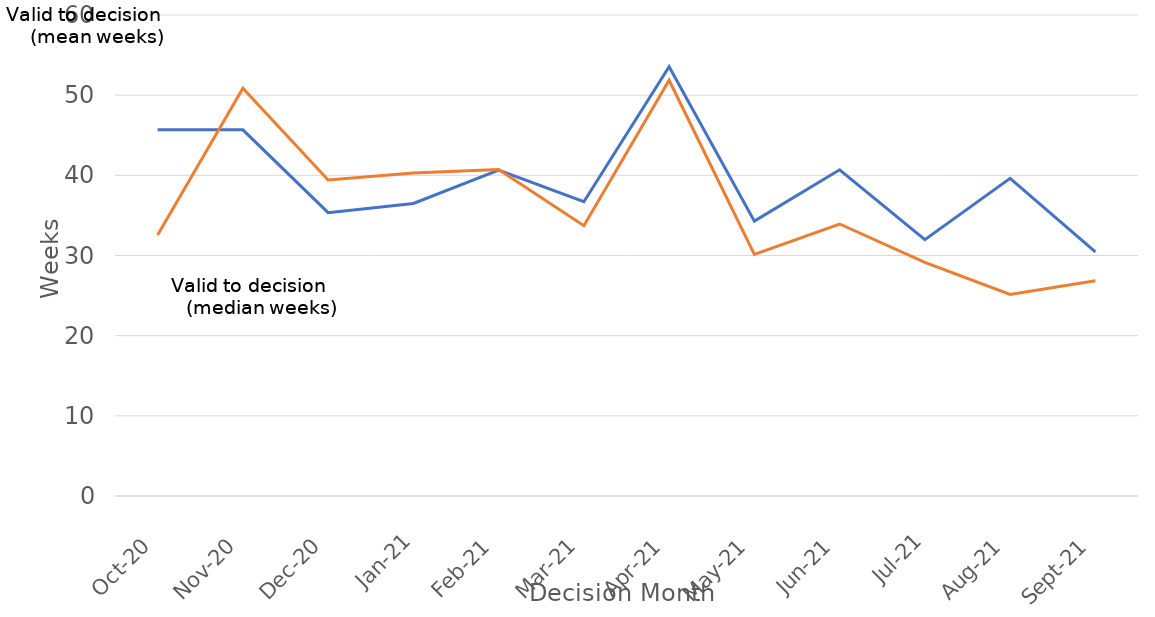
| Category | Valid to Decision (mean weeks) | Valid to Decision (median weeks) |
|---|---|---|
| 2020-10-01 | 45.673 | 32.571 |
| 2020-11-01 | 45.673 | 50.857 |
| 2020-12-01 | 35.349 | 39.429 |
| 2021-01-01 | 36.495 | 40.286 |
| 2021-02-01 | 40.661 | 40.714 |
| 2021-03-01 | 36.705 | 33.714 |
| 2021-04-01 | 53.538 | 51.857 |
| 2021-05-01 | 34.286 | 30.143 |
| 2021-06-01 | 40.695 | 33.929 |
| 2021-07-01 | 31.974 | 29.143 |
| 2021-08-01 | 39.619 | 25.143 |
| 2021-09-01 | 30.466 | 26.857 |